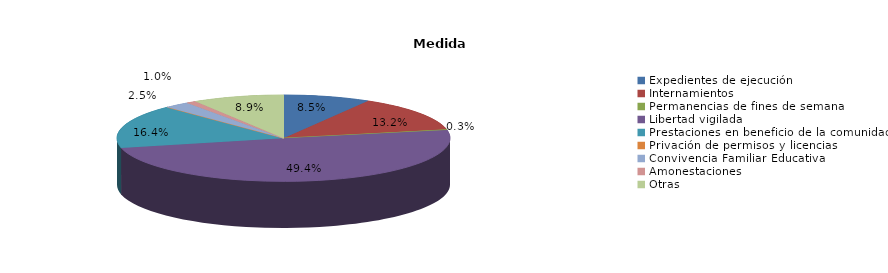
| Category | Series 0 |
|---|---|
| Expedientes de ejecución | 62 |
| Internamientos | 97 |
| Permanencias de fines de semana | 2 |
| Libertad vigilada | 362 |
| Prestaciones en beneficio de la comunidad | 120 |
| Privación de permisos y licencias | 0 |
| Convivencia Familiar Educativa | 18 |
| Amonestaciones | 7 |
| Otras | 65 |